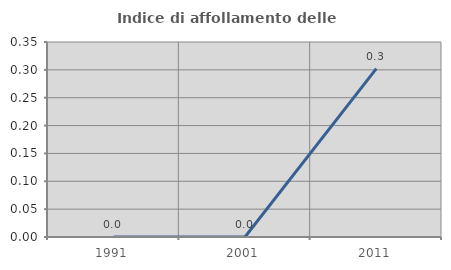
| Category | Indice di affollamento delle abitazioni  |
|---|---|
| 1991.0 | 0 |
| 2001.0 | 0 |
| 2011.0 | 0.302 |